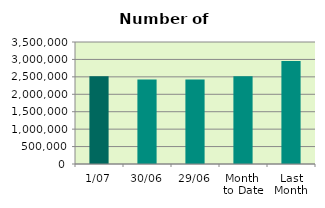
| Category | Series 0 |
|---|---|
| 1/07 | 2517004 |
| 30/06 | 2427276 |
| 29/06 | 2425538 |
| Month 
to Date | 2517004 |
| Last
Month | 2956117.636 |